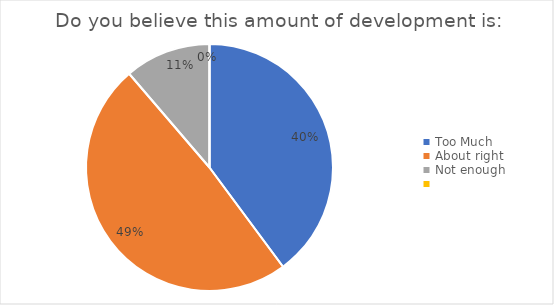
| Category | Do you believe this amount of development is: |
|---|---|
| Too Much            | 53 |
| About right            | 65 |
| Not enough | 15 |